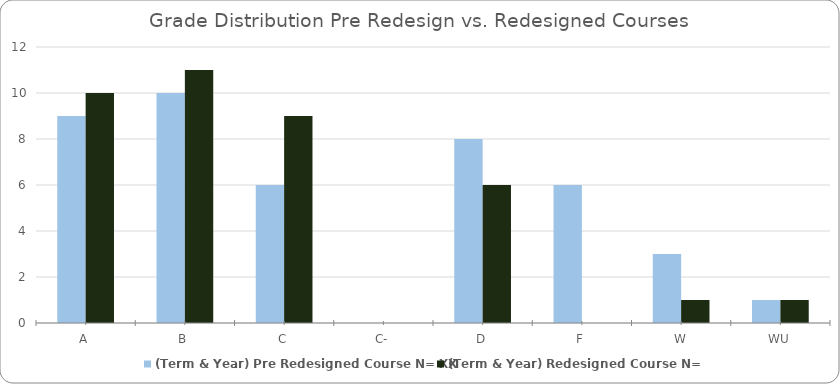
| Category | (Term & Year) Pre Redesigned Course N= XX | (Term & Year) Redesigned Course N=YY |
|---|---|---|
| A | 9 | 10 |
| B | 10 | 11 |
| C | 6 | 9 |
| C- | 0 | 0 |
| D | 8 | 6 |
| F | 6 | 0 |
| W | 3 | 1 |
| WU | 1 | 1 |